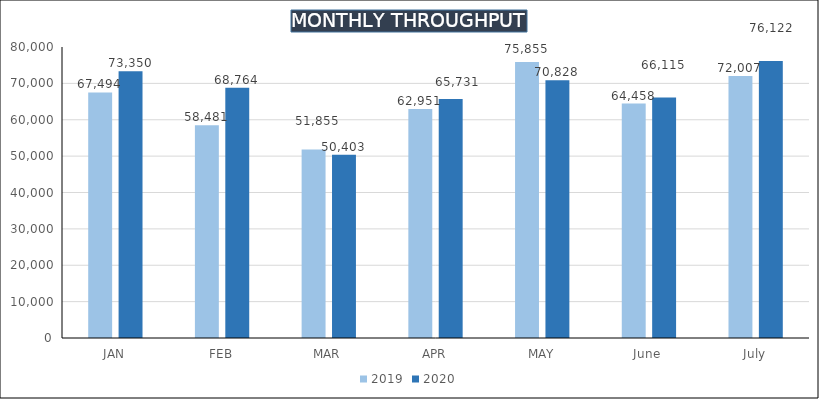
| Category | 2019 | 2020 |
|---|---|---|
| JAN | 67494 | 73350 |
| FEB | 58481 | 68764 |
| MAR | 51855 | 50403 |
| APR | 62951 | 65731 |
| MAY | 75855 | 70828 |
| June | 64458 | 66115 |
| July | 72007 | 76122 |